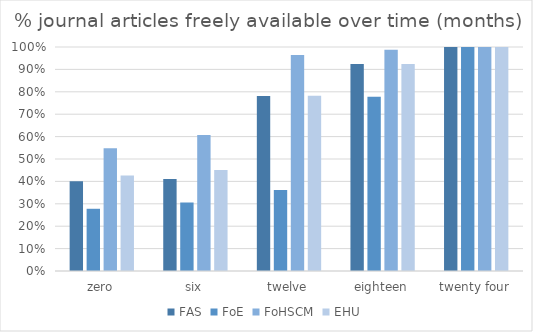
| Category | FAS | FoE | FoHSCM | EHU |
|---|---|---|---|---|
| zero | 0.401 | 0.278 | 0.548 | 0.426 |
| six | 0.411 | 0.306 | 0.607 | 0.451 |
| twelve | 0.782 | 0.361 | 0.964 | 0.782 |
| eighteen | 0.924 | 0.778 | 0.988 | 0.924 |
| twenty four | 1 | 1 | 1 | 1 |